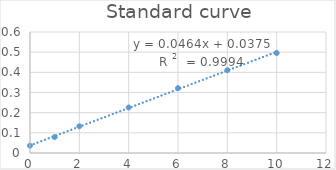
| Category | Series 0 |
|---|---|
| 0.0 | 0.036 |
| 1.0 | 0.079 |
| 2.0 | 0.132 |
| 4.0 | 0.226 |
| 6.0 | 0.322 |
| 8.0 | 0.411 |
| 10.0 | 0.496 |